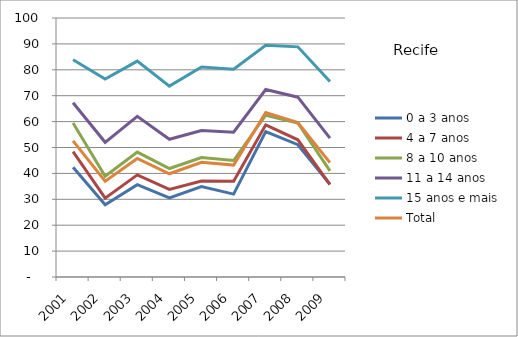
| Category | 0 a 3 anos | 4 a 7 anos | 8 a 10 anos | 11 a 14 anos | 15 anos e mais | Total |
|---|---|---|---|---|---|---|
| 2001.0 | 42.37 | 48.38 | 59.45 | 67.28 | 83.87 | 52.58 |
| 2002.0 | 27.9 | 30.46 | 38.9 | 52.01 | 76.45 | 36.95 |
| 2003.0 | 35.67 | 39.44 | 48.23 | 62.02 | 83.37 | 45.79 |
| 2004.0 | 30.54 | 33.84 | 41.88 | 53.16 | 73.71 | 39.86 |
| 2005.0 | 34.92 | 37.07 | 46.1 | 56.58 | 81.06 | 44.26 |
| 2006.0 | 32.01 | 36.95 | 44.98 | 55.93 | 80.21 | 43.22 |
| 2007.0 | 56.12 | 58.75 | 62.46 | 72.4 | 89.48 | 63.48 |
| 2008.0 | 51.08 | 52.98 | 59.47 | 69.43 | 88.86 | 59.61 |
| 2009.0 | 35.79 | 35.64 | 40.98 | 53.62 | 75.51 | 44.14 |